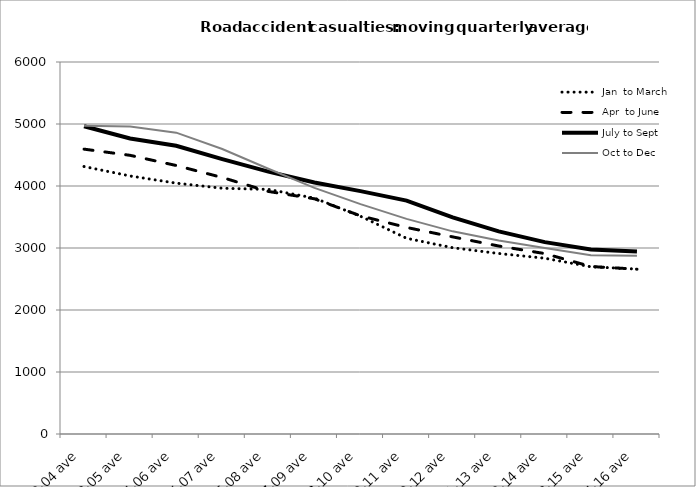
| Category | Jan  to March | Apr  to June | July to Sept | Oct to Dec |
|---|---|---|---|---|
| 2002-04 ave | 4314 | 4594.667 | 4963 | 4972.667 |
| 2003-05 ave | 4161.667 | 4494.667 | 4766 | 4958.667 |
| 2004-06 ave | 4046 | 4330.667 | 4648.667 | 4860 |
| 2005-07 ave | 3963.667 | 4137 | 4433 | 4597.333 |
| 2006-08 ave | 3945 | 3912.333 | 4231.667 | 4277.667 |
| 2007-09 ave | 3804.667 | 3793.667 | 4056.333 | 3970 |
| 2008-10 ave | 3512.667 | 3519 | 3917.667 | 3708.333 |
| 2009-11 ave | 3156.333 | 3331.333 | 3765 | 3469.667 |
| 2010-12 ave | 3004.333 | 3179.333 | 3493 | 3268.667 |
| 2011-13 ave | 2911.333 | 3032 | 3267.667 | 3122.333 |
| 2012-14 ave | 2835 | 2910 | 3094.333 | 3001 |
| 2013-15 ave | 2697 | 2701.667 | 2975.333 | 2885 |
| 2014-16 ave | 2660 | 2658.5 | 2943 | 2876 |